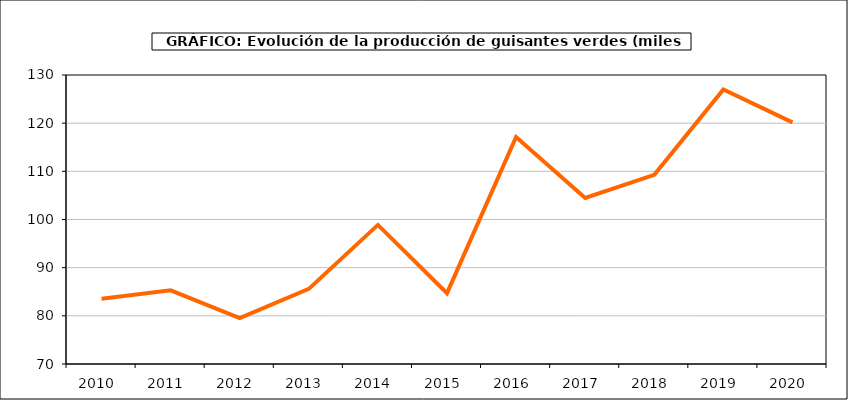
| Category | producción |
|---|---|
| 2010.0 | 83.53 |
| 2011.0 | 85.3 |
| 2012.0 | 79.511 |
| 2013.0 | 85.601 |
| 2014.0 | 98.878 |
| 2015.0 | 84.705 |
| 2016.0 | 117.126 |
| 2017.0 | 104.472 |
| 2018.0 | 109.27 |
| 2019.0 | 126.984 |
| 2020.0 | 120.165 |